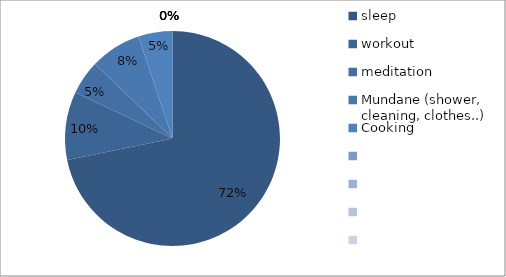
| Category | Series 0 |
|---|---|
| sleep | 8.711 |
| workout | 1.244 |
| meditation | 0.622 |
| Mundane (shower, cleaning, clothes..) | 0.933 |
| Cooking | 0.622 |